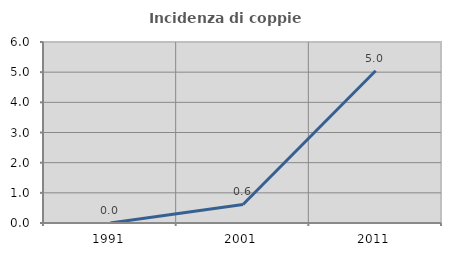
| Category | Incidenza di coppie miste |
|---|---|
| 1991.0 | 0 |
| 2001.0 | 0.613 |
| 2011.0 | 5.047 |